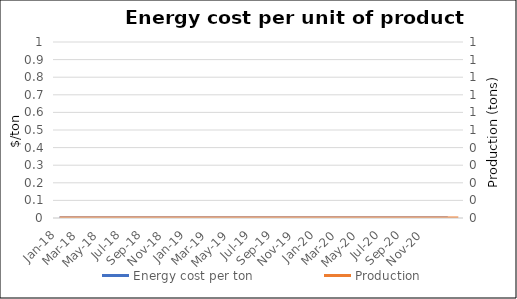
| Category | Energy cost per ton |
|---|---|
| Jan-18 | 0 |
| Feb-18 | 0 |
| Mar-18 | 0 |
| Apr-18 | 0 |
| May-18 | 0 |
| Jun-18 | 0 |
| Jul-18 | 0 |
| Aug-18 | 0 |
| Sep-18 | 0 |
| Oct-18 | 0 |
| Nov-18 | 0 |
| Dec-18 | 0 |
| Jan-19 | 0 |
| Feb-19 | 0 |
| Mar-19 | 0 |
| Apr-19 | 0 |
| May-19 | 0 |
| Jun-19 | 0 |
| Jul-19 | 0 |
| Aug-19 | 0 |
| Sep-19 | 0 |
| Oct-19 | 0 |
| Nov-19 | 0 |
| Dec-19 | 0 |
| Jan-20 | 0 |
| Feb-20 | 0 |
| Mar-20 | 0 |
| Apr-20 | 0 |
| May-20 | 0 |
| Jun-20 | 0 |
| Jul-20 | 0 |
| Aug-20 | 0 |
| Sep-20 | 0 |
| Oct-20 | 0 |
| Nov-20 | 0 |
| Dec-20 | 0 |